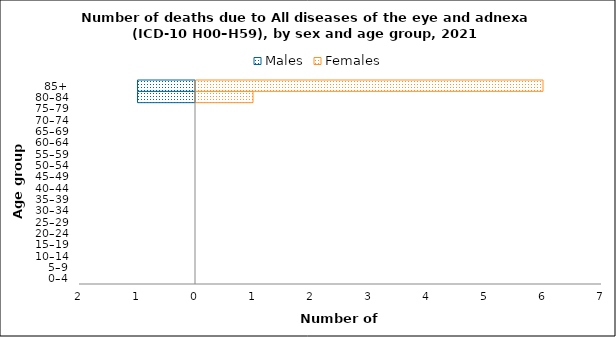
| Category | Males | Females |
|---|---|---|
| 0–4 | 0 | 0 |
| 5–9 | 0 | 0 |
| 10–14 | 0 | 0 |
| 15–19 | 0 | 0 |
| 20–24 | 0 | 0 |
| 25–29 | 0 | 0 |
| 30–34 | 0 | 0 |
| 35–39 | 0 | 0 |
| 40–44 | 0 | 0 |
| 45–49 | 0 | 0 |
| 50–54 | 0 | 0 |
| 55–59 | 0 | 0 |
| 60–64 | 0 | 0 |
| 65–69 | 0 | 0 |
| 70–74 | 0 | 0 |
| 75–79 | 0 | 0 |
| 80–84 | -1 | 1 |
| 85+ | -1 | 6 |